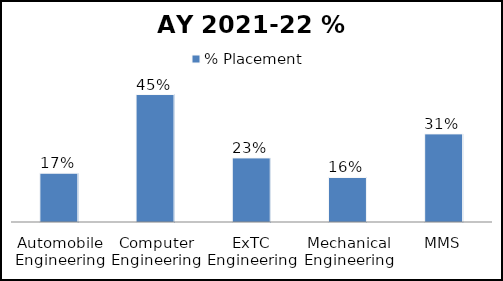
| Category | % Placement  |
|---|---|
| Automobile Engineering | 0.173 |
| Computer Engineering | 0.452 |
| ExTC Engineering | 0.227 |
| Mechanical Engineering | 0.158 |
| MMS | 0.312 |